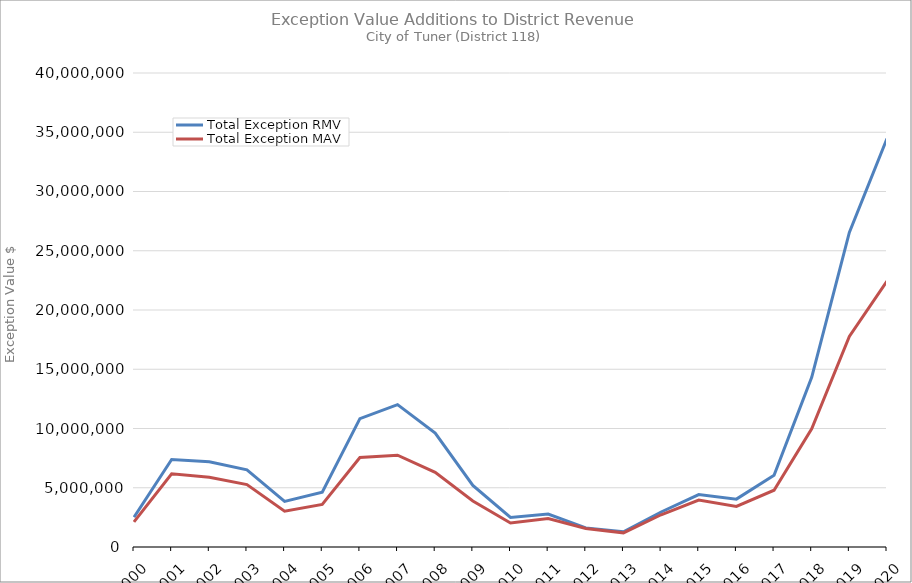
| Category | Total Exception RMV | Total Exception MAV |
|---|---|---|
| 2000.0 | 2518533 | 2113953 |
| 2001.0 | 7381527 | 6176085 |
| 2002.0 | 7193478 | 5885245 |
| 2003.0 | 6516862 | 5263312 |
| 2004.0 | 3842619 | 3026299 |
| 2005.0 | 4623819 | 3598049 |
| 2006.0 | 10835329 | 7547559 |
| 2007.0 | 12017161 | 7743931 |
| 2008.0 | 9618836 | 6294386 |
| 2009.0 | 5202147 | 3884649 |
| 2010.0 | 2493959 | 2022399 |
| 2011.0 | 2787008 | 2411045 |
| 2012.0 | 1612256 | 1561706 |
| 2013.0 | 1287919 | 1194871 |
| 2014.0 | 2953095 | 2719890 |
| 2015.0 | 4428640 | 3954600 |
| 2016.0 | 4039728 | 3422209 |
| 2017.0 | 6056855 | 4792533 |
| 2018.0 | 14313898 | 9969622 |
| 2019.0 | 26552479 | 17762993 |
| 2020.0 | 34466381 | 22431862 |